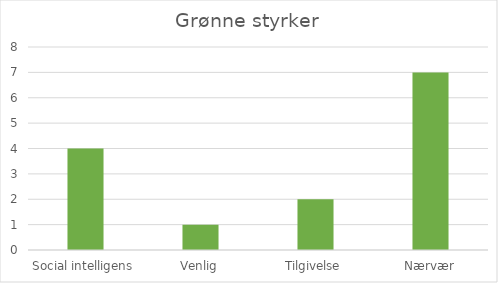
| Category | Series 0 |
|---|---|
| Social intelligens | 4 |
| Venlig | 1 |
| Tilgivelse | 2 |
| Nærvær | 7 |